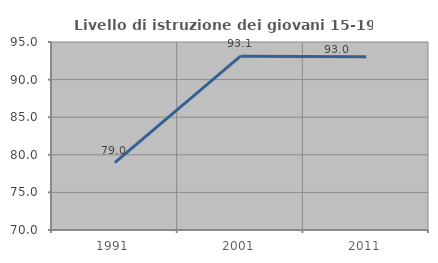
| Category | Livello di istruzione dei giovani 15-19 anni |
|---|---|
| 1991.0 | 78.95 |
| 2001.0 | 93.115 |
| 2011.0 | 93.035 |